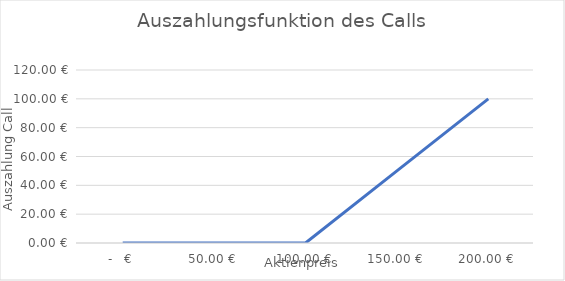
| Category | C(1) |
|---|---|
| 0.0 | 0 |
| 50.0 | 0 |
| 100.0 | 0 |
| 150.0 | 50 |
| 200.0 | 100 |